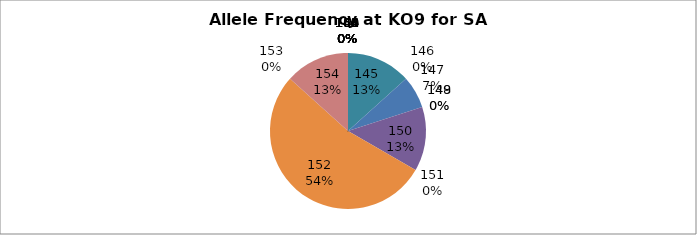
| Category | Series 0 |
|---|---|
| 140.0 | 0 |
| 141.0 | 0 |
| 142.0 | 0 |
| 143.0 | 0 |
| 145.0 | 0.133 |
| 146.0 | 0 |
| 147.0 | 0.067 |
| 148.0 | 0 |
| 149.0 | 0 |
| 150.0 | 0.133 |
| 151.0 | 0 |
| 152.0 | 0.533 |
| 153.0 | 0 |
| 154.0 | 0.133 |
| 155.0 | 0 |
| 156.0 | 0 |
| 158.0 | 0 |
| 160.0 | 0 |
| 161.0 | 0 |
| 162.0 | 0 |
| 164.0 | 0 |
| 166.0 | 0 |